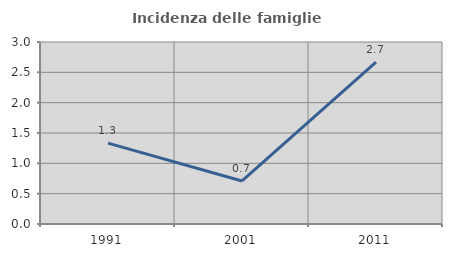
| Category | Incidenza delle famiglie numerose |
|---|---|
| 1991.0 | 1.333 |
| 2001.0 | 0.709 |
| 2011.0 | 2.667 |